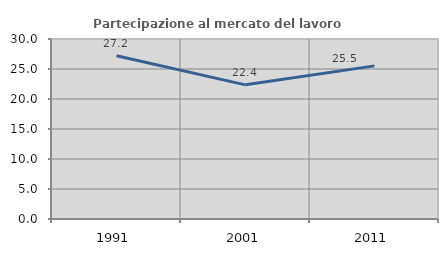
| Category | Partecipazione al mercato del lavoro  femminile |
|---|---|
| 1991.0 | 27.215 |
| 2001.0 | 22.36 |
| 2011.0 | 25.52 |